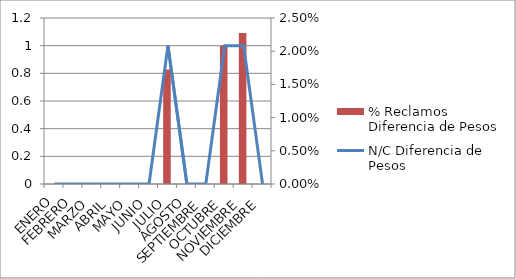
| Category | % Reclamos Diferencia de Pesos |
|---|---|
| ENERO | 0 |
| FEBRERO | 0 |
| MARZO | 0 |
| ABRIL | 0 |
| MAYO | 0 |
| JUNIO | 0 |
| JULIO | 0.017 |
| AGOSTO | 0 |
| SEPTIEMBRE | 0 |
| OCTUBRE | 0.021 |
| NOVIEMBRE | 0.023 |
| DICIEMBRE | 0 |